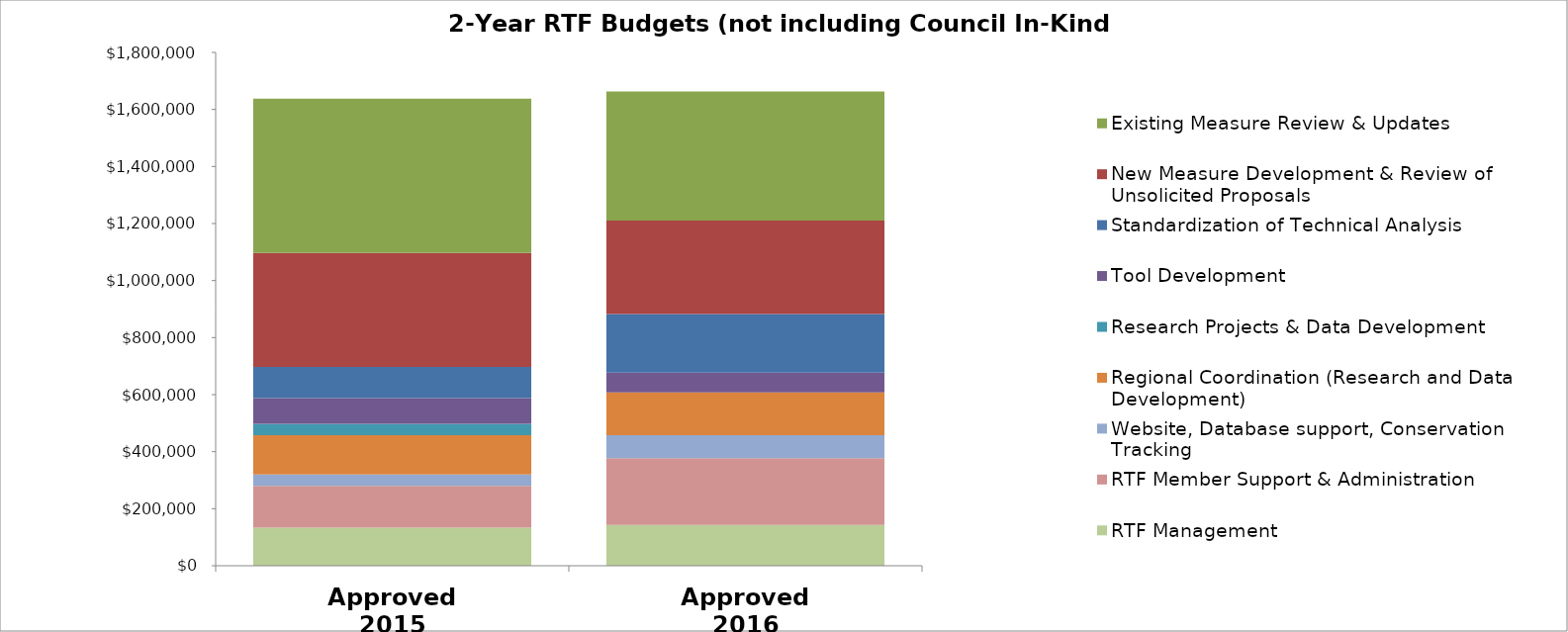
| Category | RTF Management | RTF Member Support & Administration | Website, Database support, Conservation Tracking  | Regional Coordination (Research and Data Development) | Research Projects & Data Development | Tool Development | Standardization of Technical Analysis | New Measure Development & Review of Unsolicited Proposals | Existing Measure Review & Updates |
|---|---|---|---|---|---|---|---|---|---|
| Approved 2015 | 133300 | 146800 | 40000 | 137500 | 40000 | 90500 | 109000 | 400000 | 540500 |
| Approved 2016 | 143300 | 234200 | 80000 | 150000 | 0 | 70000 | 205000 | 328000 | 452500 |